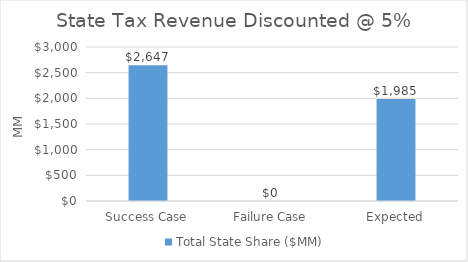
| Category | Total State Share ($MM) |
|---|---|
| Success Case | 2646.502 |
| Failure Case | 0.096 |
| Expected | 1984.901 |